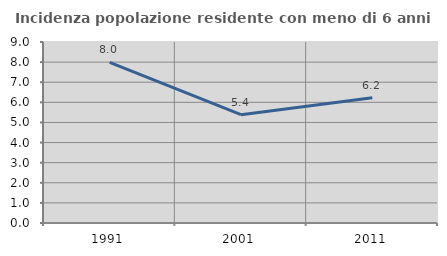
| Category | Incidenza popolazione residente con meno di 6 anni |
|---|---|
| 1991.0 | 7.987 |
| 2001.0 | 5.387 |
| 2011.0 | 6.229 |